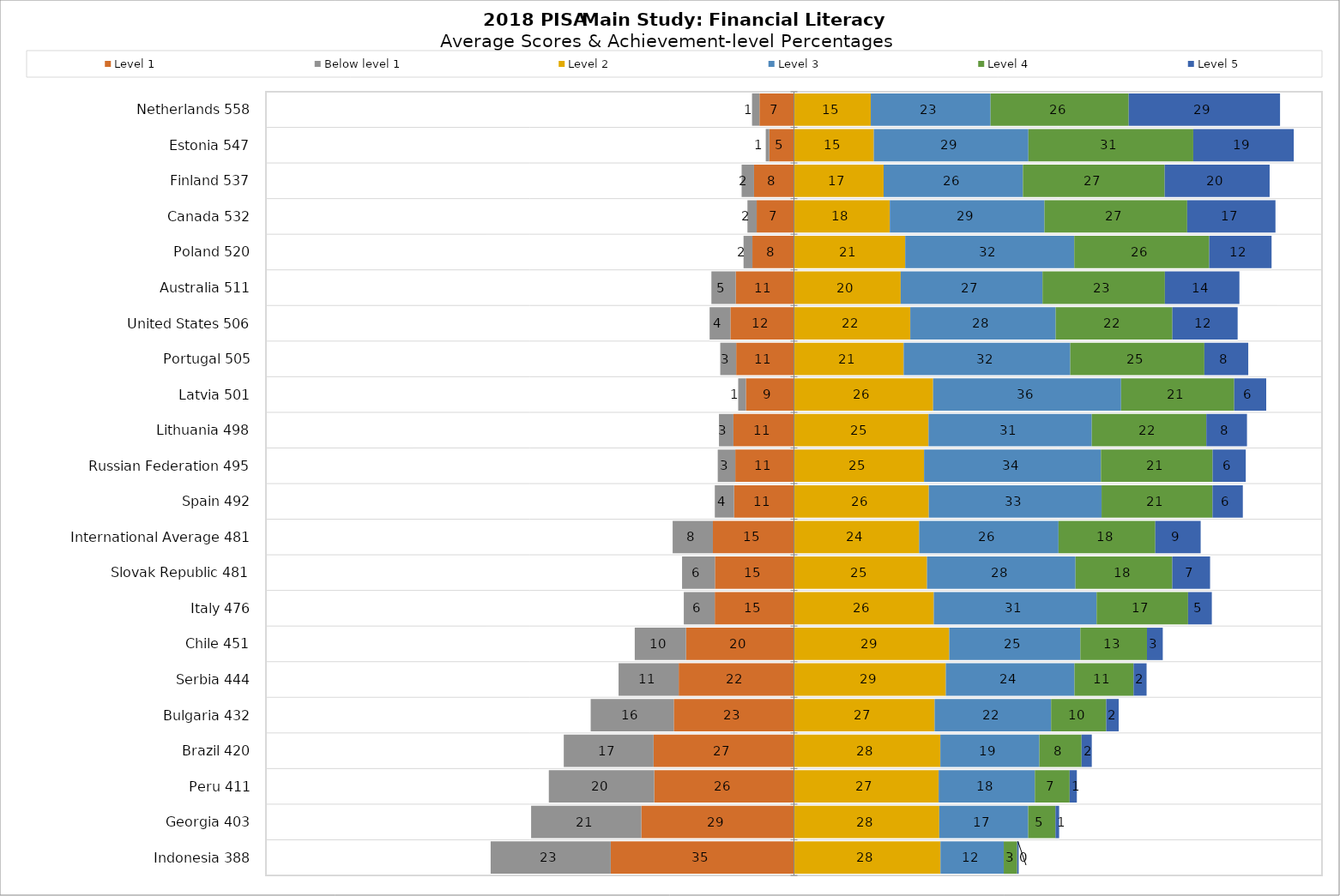
| Category | Level 1 | Below level 1 | Level 2 | Level 3 | Level 4 | Level 5 |
|---|---|---|---|---|---|---|
| Indonesia 388 | -34.703 | -22.739 | 27.747 | 11.982 | 2.544 | 0.285 |
| Georgia 403 | -28.913 | -20.868 | 27.513 | 16.849 | 5.159 | 0.698 |
| Peru 411 | -26.47 | -19.955 | 27.402 | 18.223 | 6.581 | 1.368 |
| Brazil 420 | -26.587 | -17.009 | 27.724 | 18.756 | 7.984 | 1.94 |
| Bulgaria 432 | -22.764 | -15.732 | 26.635 | 22.061 | 10.437 | 2.37 |
| Serbia 444 | -21.831 | -11.386 | 28.759 | 24.366 | 11.186 | 2.471 |
| Chile 451 | -20.446 | -9.707 | 29.405 | 24.832 | 12.617 | 2.993 |
| Italy 476 | -15.002 | -5.862 | 26.482 | 30.835 | 17.319 | 4.501 |
| Slovak Republic 481 | -14.967 | -6.226 | 25.195 | 28.124 | 18.327 | 7.161 |
| International Average 481 | -15.355 | -7.621 | 23.702 | 26.399 | 18.33 | 8.594 |
| Spain 492 | -11.349 | -3.642 | 25.535 | 32.72 | 21.015 | 5.74 |
| Russian Federation 495 | -11.112 | -3.324 | 24.638 | 33.5 | 21.152 | 6.274 |
| Lithuania 498 | -11.464 | -2.74 | 25.479 | 30.924 | 21.692 | 7.701 |
| Latvia 501 | -9.106 | -1.454 | 26.349 | 35.597 | 21.425 | 6.069 |
| Portugal 505 | -10.942 | -3.02 | 20.775 | 31.553 | 25.393 | 8.317 |
| United States 506 | -12.04 | -3.933 | 22.03 | 27.535 | 22.102 | 12.36 |
| Australia 511 | -11.031 | -4.607 | 20.21 | 26.86 | 23.177 | 14.115 |
| Poland 520 | -7.873 | -1.675 | 21.068 | 32.018 | 25.558 | 11.809 |
| Canada 532 | -7.06 | -1.75 | 18.147 | 29.295 | 27.026 | 16.721 |
| Finland 537 | -7.563 | -2.35 | 16.977 | 26.385 | 26.846 | 19.879 |
| Estonia 547 | -4.684 | -0.661 | 15.119 | 29.276 | 31.228 | 19.032 |
| Netherlands 558 | -6.535 | -1.408 | 14.547 | 22.685 | 26.162 | 28.663 |